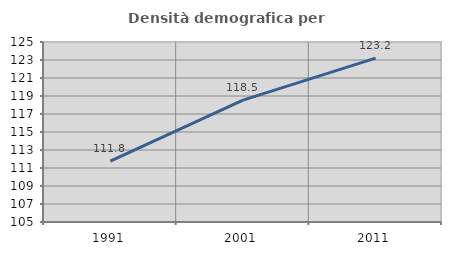
| Category | Densità demografica |
|---|---|
| 1991.0 | 111.763 |
| 2001.0 | 118.537 |
| 2011.0 | 123.214 |